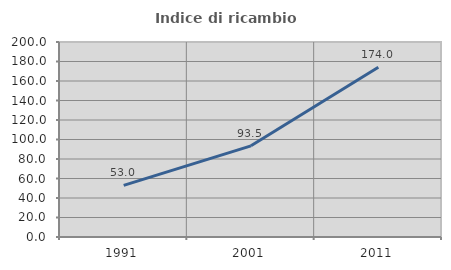
| Category | Indice di ricambio occupazionale  |
|---|---|
| 1991.0 | 52.97 |
| 2001.0 | 93.525 |
| 2011.0 | 174.016 |